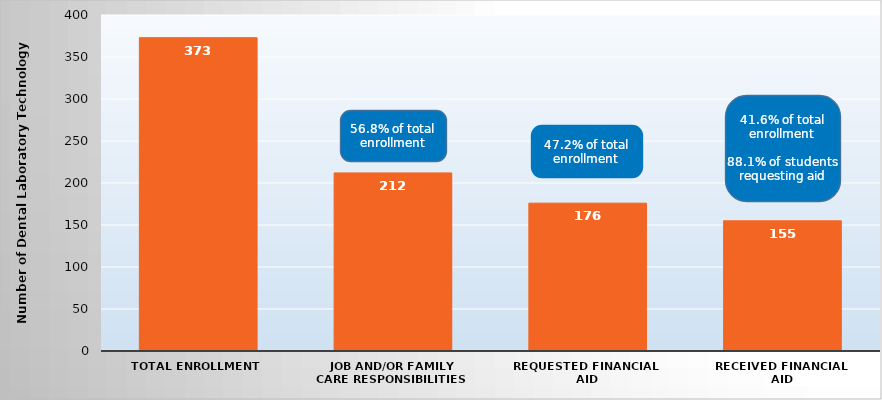
| Category | Series 0 |
|---|---|
| Total Enrollment | 373 |
| Job and/or Family Care Responsibilities | 212 |
| Requested Financial Aid | 176 |
| Received Financial Aid | 155 |